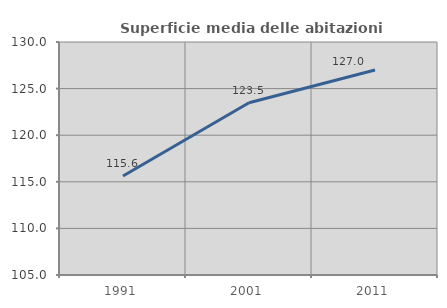
| Category | Superficie media delle abitazioni occupate |
|---|---|
| 1991.0 | 115.621 |
| 2001.0 | 123.489 |
| 2011.0 | 127 |